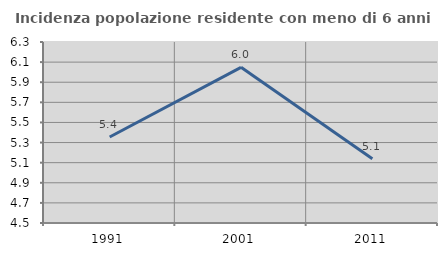
| Category | Incidenza popolazione residente con meno di 6 anni |
|---|---|
| 1991.0 | 5.356 |
| 2001.0 | 6.048 |
| 2011.0 | 5.138 |